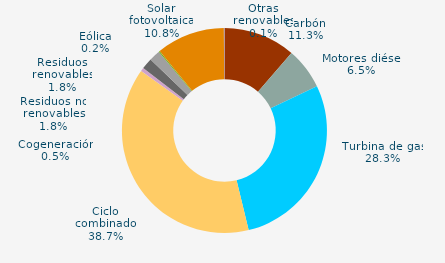
| Category | Series 0 |
|---|---|
| Carbón | 11.332 |
| Motores diésel | 6.549 |
| Turbina de gas | 28.334 |
| Ciclo combinado | 38.661 |
| Generación auxiliar | 0 |
| Cogeneración | 0.541 |
| Residuos no renovables | 1.757 |
| Residuos renovables | 1.757 |
| Eólica | 0.169 |
| Solar fotovoltaica | 10.799 |
| Otras renovables | 0.1 |